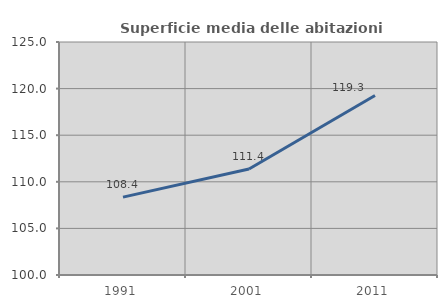
| Category | Superficie media delle abitazioni occupate |
|---|---|
| 1991.0 | 108.352 |
| 2001.0 | 111.38 |
| 2011.0 | 119.257 |